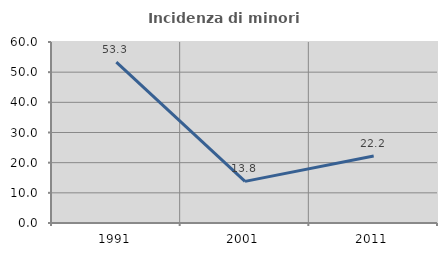
| Category | Incidenza di minori stranieri |
|---|---|
| 1991.0 | 53.333 |
| 2001.0 | 13.793 |
| 2011.0 | 22.222 |